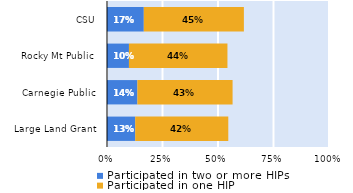
| Category | Participated in two or more HIPs | Participated in one HIP |
|---|---|---|
| Large Land Grant | 0.127 | 0.419 |
| Carnegie Public | 0.137 | 0.429 |
| Rocky Mt Public | 0.099 | 0.444 |
| CSU | 0.166 | 0.451 |